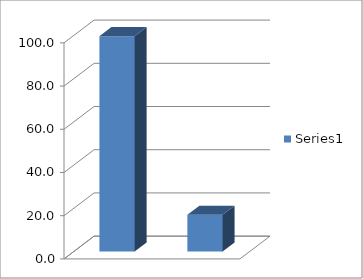
| Category | Series 0 |
|---|---|
| 0 | 99.673 |
| 1 | 17 |